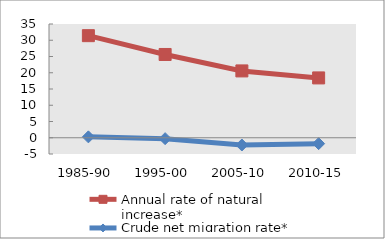
| Category | Annual rate of natural increase* | Crude net migration rate* |
|---|---|---|
| 1985-90 | 31.413 | 0.272 |
| 1995-00 | 25.624 | -0.277 |
| 2005-10 | 20.567 | -2.231 |
| 2010-15 | 18.411 | -1.81 |